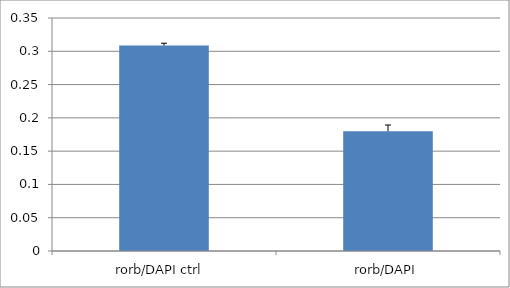
| Category | Series 0 |
|---|---|
| rorb/DAPI ctrl  | 0.309 |
| rorb/DAPI | 0.18 |